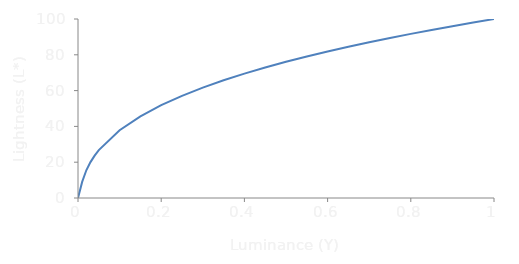
| Category | Series 0 |
|---|---|
| 0.0 | 0 |
| 0.01 | 8.991 |
| 0.02 | 15.487 |
| 0.03 | 20.044 |
| 0.04 | 23.671 |
| 0.05 | 26.735 |
| 0.1 | 37.842 |
| 0.15 | 45.634 |
| 0.2 | 51.837 |
| 0.25 | 57.075 |
| 0.3 | 61.654 |
| 0.35 | 65.749 |
| 0.4 | 69.47 |
| 0.45 | 72.892 |
| 0.5 | 76.069 |
| 0.55 | 79.041 |
| 0.6 | 81.838 |
| 0.65 | 84.484 |
| 0.7 | 86.997 |
| 0.75 | 89.393 |
| 0.8 | 91.685 |
| 0.85 | 93.883 |
| 0.9 | 95.997 |
| 0.95 | 98.034 |
| 1.0 | 100 |